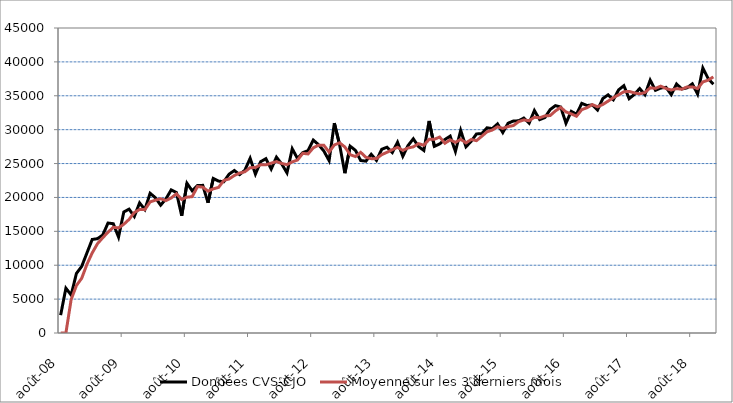
| Category | Données CVS-CJO | Moyenne sur les 3 derniers mois |
|---|---|---|
| 2008-08-01 | 2633.204 | 0 |
| 2008-09-01 | 6606.2 | 0 |
| 2008-10-01 | 5606.063 | 4948.489 |
| 2008-11-01 | 8792.303 | 7001.522 |
| 2008-12-01 | 9821.891 | 8073.419 |
| 2009-01-01 | 11816.43 | 10143.541 |
| 2009-02-01 | 13801.239 | 11813.187 |
| 2009-03-01 | 13916.738 | 13178.136 |
| 2009-04-01 | 14455.093 | 14057.69 |
| 2009-05-01 | 16224.293 | 14865.375 |
| 2009-06-01 | 16124.559 | 15601.315 |
| 2009-07-01 | 14154.138 | 15500.996 |
| 2009-08-01 | 17855.459 | 16044.718 |
| 2009-09-01 | 18275.676 | 16761.757 |
| 2009-10-01 | 17193.108 | 17774.747 |
| 2009-11-01 | 19194.329 | 18221.038 |
| 2009-12-01 | 18209.269 | 18198.902 |
| 2010-01-01 | 20616.123 | 19339.907 |
| 2010-02-01 | 19957.844 | 19594.412 |
| 2010-03-01 | 18862.042 | 19812.003 |
| 2010-04-01 | 19780.982 | 19533.623 |
| 2010-05-01 | 21109.163 | 19917.396 |
| 2010-06-01 | 20728.669 | 20539.605 |
| 2010-07-01 | 17298.271 | 19712.034 |
| 2010-08-01 | 22086.733 | 20037.891 |
| 2010-09-01 | 20973.091 | 20119.365 |
| 2010-10-01 | 21772.497 | 21610.773 |
| 2010-11-01 | 21781.629 | 21509.072 |
| 2010-12-01 | 19223.744 | 20925.956 |
| 2011-01-01 | 22804.252 | 21269.875 |
| 2011-02-01 | 22415.073 | 21481.023 |
| 2011-03-01 | 22320.957 | 22513.427 |
| 2011-04-01 | 23433.448 | 22723.159 |
| 2011-05-01 | 23971.647 | 23242.017 |
| 2011-06-01 | 23373.334 | 23592.81 |
| 2011-07-01 | 24022.133 | 23789.038 |
| 2011-08-01 | 25771.29 | 24388.919 |
| 2011-09-01 | 23439.1 | 24410.841 |
| 2011-10-01 | 25279.68 | 24830.024 |
| 2011-11-01 | 25721.435 | 24813.405 |
| 2011-12-01 | 24182.05 | 25061.055 |
| 2012-01-01 | 25939.495 | 25280.993 |
| 2012-02-01 | 24936.321 | 25019.289 |
| 2012-03-01 | 23632.358 | 24836.058 |
| 2012-04-01 | 27180.064 | 25249.581 |
| 2012-05-01 | 25738.835 | 25517.086 |
| 2012-06-01 | 26614.172 | 26511.023 |
| 2012-07-01 | 26902.968 | 26418.658 |
| 2012-08-01 | 28460.443 | 27325.861 |
| 2012-09-01 | 27783.39 | 27715.6 |
| 2012-10-01 | 26852.914 | 27698.916 |
| 2012-11-01 | 25440.65 | 26692.318 |
| 2012-12-01 | 30964.052 | 27752.539 |
| 2013-01-01 | 27778.353 | 28061.018 |
| 2013-02-01 | 23584.078 | 27442.161 |
| 2013-03-01 | 27563.459 | 26308.63 |
| 2013-04-01 | 26951.741 | 26033.092 |
| 2013-05-01 | 25447.896 | 26654.365 |
| 2013-06-01 | 25356.779 | 25918.805 |
| 2013-07-01 | 26366.141 | 25723.606 |
| 2013-08-01 | 25470.285 | 25731.069 |
| 2013-09-01 | 27106.795 | 26314.407 |
| 2013-10-01 | 27411.732 | 26662.938 |
| 2013-11-01 | 26626.837 | 27048.455 |
| 2013-12-01 | 28143.853 | 27394.141 |
| 2014-01-01 | 26078.252 | 26949.647 |
| 2014-02-01 | 27659.461 | 27293.856 |
| 2014-03-01 | 28652.987 | 27463.567 |
| 2014-04-01 | 27503.368 | 27938.605 |
| 2014-05-01 | 26932.527 | 27696.294 |
| 2014-06-01 | 31284.573 | 28573.489 |
| 2014-07-01 | 27538.257 | 28585.119 |
| 2014-08-01 | 27897.277 | 28906.702 |
| 2014-09-01 | 28550.094 | 27995.209 |
| 2014-10-01 | 29046.133 | 28497.835 |
| 2014-11-01 | 26787.947 | 28128.058 |
| 2014-12-01 | 29887.943 | 28574.008 |
| 2015-01-01 | 27473.251 | 28049.714 |
| 2015-02-01 | 28289.557 | 28550.25 |
| 2015-03-01 | 29372.453 | 28378.421 |
| 2015-04-01 | 29408.205 | 29023.405 |
| 2015-05-01 | 30274.011 | 29684.89 |
| 2015-06-01 | 30160.75 | 29947.655 |
| 2015-07-01 | 30847.729 | 30427.497 |
| 2015-08-01 | 29574.151 | 30194.21 |
| 2015-09-01 | 30948.59 | 30456.824 |
| 2015-10-01 | 31274.677 | 30599.139 |
| 2015-11-01 | 31308.089 | 31177.119 |
| 2015-12-01 | 31713.238 | 31432.001 |
| 2016-01-01 | 30955.23 | 31325.519 |
| 2016-02-01 | 32820.627 | 31829.698 |
| 2016-03-01 | 31480.923 | 31752.26 |
| 2016-04-01 | 31790.533 | 32030.694 |
| 2016-05-01 | 32972.423 | 32081.293 |
| 2016-06-01 | 33546.044 | 32769.666 |
| 2016-07-01 | 33339.614 | 33286.027 |
| 2016-08-01 | 30954.668 | 32613.442 |
| 2016-09-01 | 32703.485 | 32332.589 |
| 2016-10-01 | 32280.557 | 31979.57 |
| 2016-11-01 | 33881.3 | 32955.114 |
| 2016-12-01 | 33560.503 | 33240.786 |
| 2017-01-01 | 33651.459 | 33697.754 |
| 2017-02-01 | 32903.901 | 33371.954 |
| 2017-03-01 | 34590.658 | 33715.34 |
| 2017-04-01 | 35139.298 | 34211.286 |
| 2017-05-01 | 34412.866 | 34714.274 |
| 2017-06-01 | 35874.098 | 35142.087 |
| 2017-07-01 | 36488.334 | 35591.766 |
| 2017-08-01 | 34573.478 | 35645.303 |
| 2017-09-01 | 35210.724 | 35424.179 |
| 2017-10-01 | 36067.339 | 35283.847 |
| 2017-11-01 | 35154.572 | 35477.545 |
| 2017-12-01 | 37305.811 | 36175.908 |
| 2018-01-01 | 35810.539 | 36090.308 |
| 2018-02-01 | 36144.176 | 36420.176 |
| 2018-03-01 | 36249.717 | 36068.144 |
| 2018-04-01 | 35171.549 | 35855.147 |
| 2018-05-01 | 36737.177 | 36052.814 |
| 2018-06-01 | 36005.823 | 35971.516 |
| 2018-07-01 | 36170.216 | 36304.405 |
| 2018-08-01 | 36764.231 | 36313.424 |
| 2018-09-01 | 35256.369 | 36063.606 |
| 2018-10-01 | 39100.479 | 37040.36 |
| 2018-11-01 | 37557.988 | 37304.945 |
| 2018-12-01 | 36699.474 | 37785.98 |